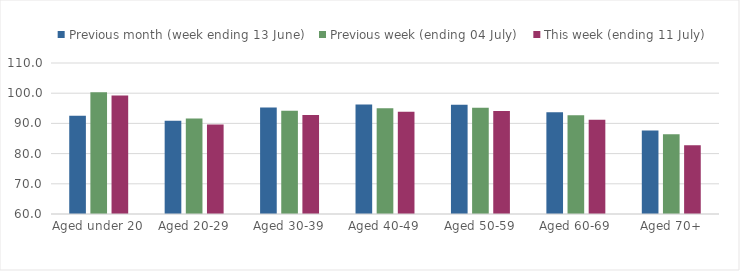
| Category | Previous month (week ending 13 June) | Previous week (ending 04 July) | This week (ending 11 July) |
|---|---|---|---|
| Aged under 20 | 92.528 | 100.34 | 99.246 |
| Aged 20-29 | 90.885 | 91.589 | 89.616 |
| Aged 30-39 | 95.27 | 94.193 | 92.789 |
| Aged 40-49 | 96.279 | 94.993 | 93.858 |
| Aged 50-59 | 96.213 | 95.174 | 94.126 |
| Aged 60-69 | 93.666 | 92.695 | 91.247 |
| Aged 70+ | 87.614 | 86.429 | 82.743 |